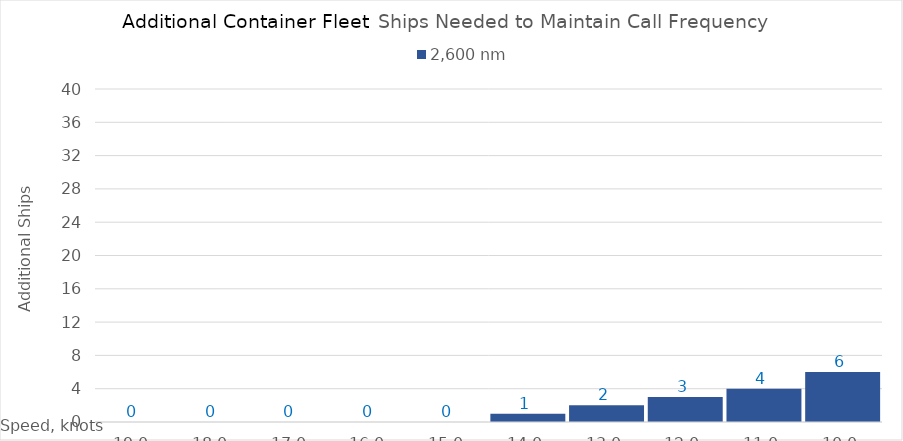
| Category | 2,600 |
|---|---|
| 19.0 | 0 |
| 18.0 | 0 |
| 17.0 | 0 |
| 16.0 | 0 |
| 15.0 | 0 |
| 14.0 | 1 |
| 13.0 | 2 |
| 12.0 | 3 |
| 11.0 | 4 |
| 10.0 | 6 |